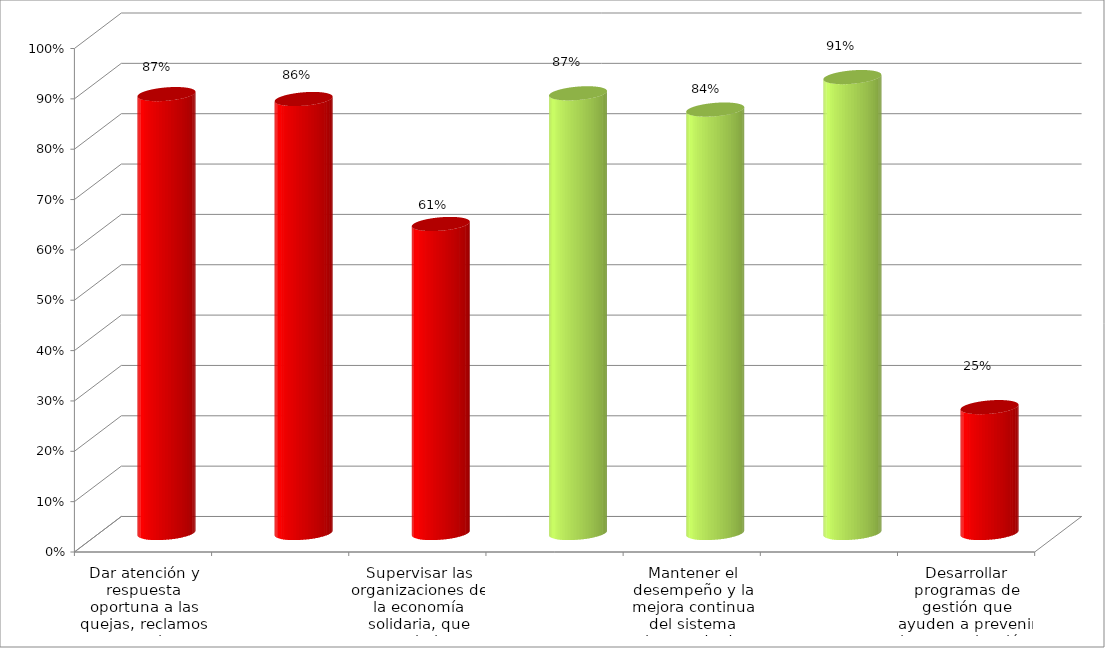
| Category | Series 0 |
|---|---|
| Dar atención y respuesta oportuna a las quejas, reclamos y consultas, formuladas por la ciudadania. | 0.872 |
| Formular, desarrollar y ejecutar, oportunamente, los proyectos de inversión de la entidad. | 0.862 |
| Supervisar las organizaciones de la economía solidaria, que estan bajo su competencia. | 0.614 |
| Mejorar los canales internos y externos de comunicación de la entidad. | 0.873 |
| Mantener el desempeño y la mejora continua del sistema integrado de gestión  | 0.841 |
| Mejorar la calidad del servicio y el medio ambiente fortaleciendo el Talento Humano. | 0.906 |
| Desarrollar programas de gestión que ayuden a prevenir la contaminación, a reducir y controlar los aspectos e impactos ambientales identificados | 0.25 |